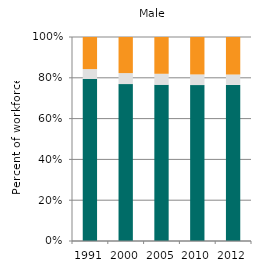
| Category | Agriculture | Industry | Services |
|---|---|---|---|
| 1991.0 | 79.413 | 4.864 | 15.723 |
| 2000.0 | 76.907 | 5.403 | 17.69 |
| 2005.0 | 76.582 | 5.389 | 18.03 |
| 2010.0 | 76.42 | 5.23 | 18.35 |
| 2012.0 | 76.523 | 5.082 | 18.395 |